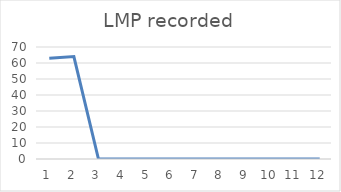
| Category | LMP recorded |
|---|---|
| 0 | 63 |
| 1 | 64 |
| 2 | 0 |
| 3 | 0 |
| 4 | 0 |
| 5 | 0 |
| 6 | 0 |
| 7 | 0 |
| 8 | 0 |
| 9 | 0 |
| 10 | 0 |
| 11 | 0 |